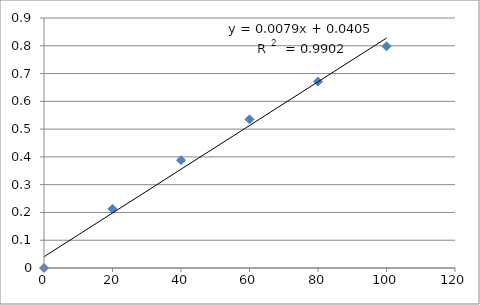
| Category | Series 0 |
|---|---|
| 0.0 | 0 |
| 20.0 | 0.213 |
| 40.0 | 0.388 |
| 60.0 | 0.535 |
| 80.0 | 0.671 |
| 100.0 | 0.798 |